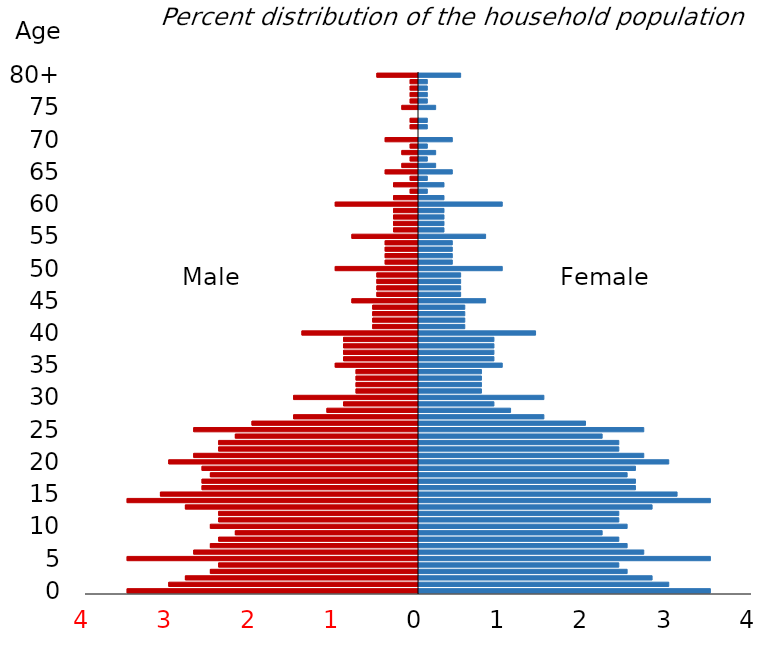
| Category | Male | Female |
|---|---|---|
| 0 | -3.5 | 3.5 |
| 1 | -3 | 3 |
| 2 | -2.8 | 2.8 |
| 3 | -2.5 | 2.5 |
| 4 | -2.4 | 2.4 |
| 5 | -3.5 | 3.5 |
| 6 | -2.7 | 2.7 |
| 7 | -2.5 | 2.5 |
| 8 | -2.4 | 2.4 |
| 9 | -2.2 | 2.2 |
| 10 | -2.5 | 2.5 |
| 11 | -2.4 | 2.4 |
| 12 | -2.4 | 2.4 |
| 13 | -2.8 | 2.8 |
| 14 | -3.5 | 3.5 |
| 15 | -3.1 | 3.1 |
| 16 | -2.6 | 2.6 |
| 17 | -2.6 | 2.6 |
| 18 | -2.5 | 2.5 |
| 19 | -2.6 | 2.6 |
| 20 | -3 | 3 |
| 21 | -2.7 | 2.7 |
| 22 | -2.4 | 2.4 |
| 23 | -2.4 | 2.4 |
| 24 | -2.2 | 2.2 |
| 25 | -2.7 | 2.7 |
| 26 | -2 | 2 |
| 27 | -1.5 | 1.5 |
| 28 | -1.1 | 1.1 |
| 29 | -0.9 | 0.9 |
| 30 | -1.5 | 1.5 |
| 31 | -0.75 | 0.75 |
| 32 | -0.75 | 0.75 |
| 33 | -0.75 | 0.75 |
| 34 | -0.75 | 0.75 |
| 35 | -1 | 1 |
| 36 | -0.9 | 0.9 |
| 37 | -0.9 | 0.9 |
| 38 | -0.9 | 0.9 |
| 39 | -0.9 | 0.9 |
| 40 | -1.4 | 1.4 |
| 41 | -0.55 | 0.55 |
| 42 | -0.55 | 0.55 |
| 43 | -0.55 | 0.55 |
| 44 | -0.55 | 0.55 |
| 45 | -0.8 | 0.8 |
| 46 | -0.5 | 0.5 |
| 47 | -0.5 | 0.5 |
| 48 | -0.5 | 0.5 |
| 49 | -0.5 | 0.5 |
| 50 | -1 | 1 |
| 51 | -0.4 | 0.4 |
| 52 | -0.4 | 0.4 |
| 53 | -0.4 | 0.4 |
| 54 | -0.4 | 0.4 |
| 55 | -0.8 | 0.8 |
| 56 | -0.3 | 0.3 |
| 57 | -0.3 | 0.3 |
| 58 | -0.3 | 0.3 |
| 59 | -0.3 | 0.3 |
| 60 | -1 | 1 |
| 61 | -0.3 | 0.3 |
| 62 | -0.1 | 0.1 |
| 63 | -0.3 | 0.3 |
| 64 | -0.1 | 0.1 |
| 65 | -0.4 | 0.4 |
| 66 | -0.2 | 0.2 |
| 67 | -0.1 | 0.1 |
| 68 | -0.2 | 0.2 |
| 69 | -0.1 | 0.1 |
| 70 | -0.4 | 0.4 |
| 71 | 0 | 0 |
| 72 | -0.1 | 0.1 |
| 73 | -0.1 | 0.1 |
| 74 | 0 | 0 |
| 75 | -0.2 | 0.2 |
| 76 | -0.1 | 0.1 |
| 77 | -0.1 | 0.1 |
| 78 | -0.1 | 0.1 |
| 79 | -0.1 | 0.1 |
| 80+ | -0.5 | 0.5 |